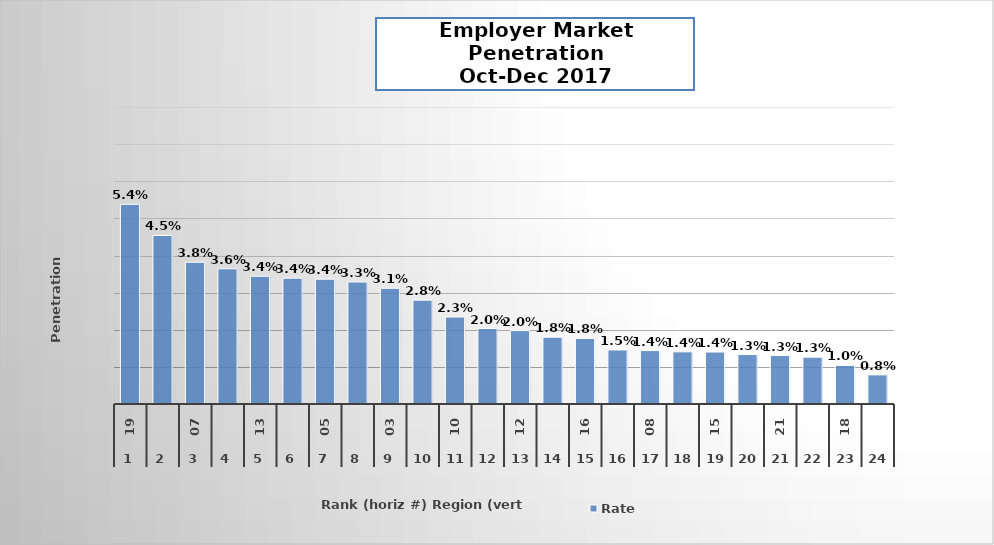
| Category | Rate |
|---|---|
| 0 | 0.054 |
| 1 | 0.045 |
| 2 | 0.038 |
| 3 | 0.036 |
| 4 | 0.034 |
| 5 | 0.034 |
| 6 | 0.034 |
| 7 | 0.033 |
| 8 | 0.031 |
| 9 | 0.028 |
| 10 | 0.023 |
| 11 | 0.02 |
| 12 | 0.02 |
| 13 | 0.018 |
| 14 | 0.018 |
| 15 | 0.015 |
| 16 | 0.014 |
| 17 | 0.014 |
| 18 | 0.014 |
| 19 | 0.013 |
| 20 | 0.013 |
| 21 | 0.013 |
| 22 | 0.01 |
| 23 | 0.008 |